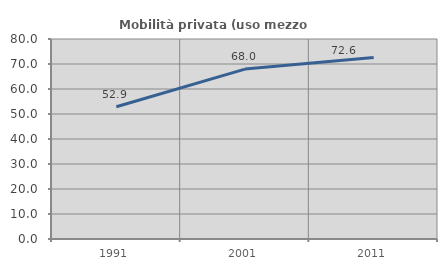
| Category | Mobilità privata (uso mezzo privato) |
|---|---|
| 1991.0 | 52.921 |
| 2001.0 | 67.963 |
| 2011.0 | 72.635 |